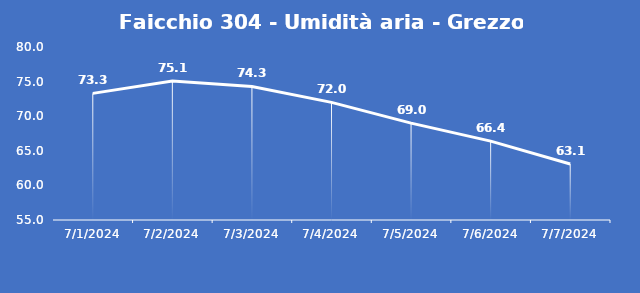
| Category | Faicchio 304 - Umidità aria - Grezzo (%) |
|---|---|
| 7/1/24 | 73.3 |
| 7/2/24 | 75.1 |
| 7/3/24 | 74.3 |
| 7/4/24 | 72 |
| 7/5/24 | 69 |
| 7/6/24 | 66.4 |
| 7/7/24 | 63.1 |